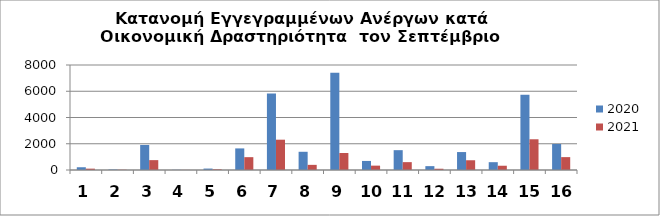
| Category | 2020 | 2021 |
|---|---|---|
| 0 | 210 | 103 |
| 1 | 37 | 20 |
| 2 | 1908 | 752 |
| 3 | 13 | 7 |
| 4 | 109 | 52 |
| 5 | 1645 | 978 |
| 6 | 5829 | 2309 |
| 7 | 1388 | 392 |
| 8 | 7409 | 1294 |
| 9 | 690 | 332 |
| 10 | 1511 | 599 |
| 11 | 294 | 96 |
| 12 | 1367 | 743 |
| 13 | 596 | 325 |
| 14 | 5733 | 2341 |
| 15 | 1979 | 981 |